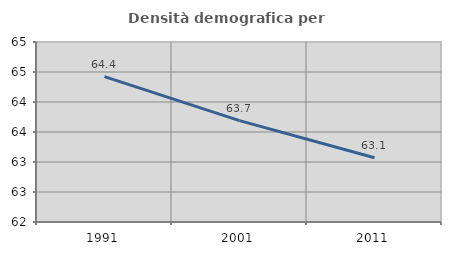
| Category | Densità demografica |
|---|---|
| 1991.0 | 64.424 |
| 2001.0 | 63.689 |
| 2011.0 | 63.071 |